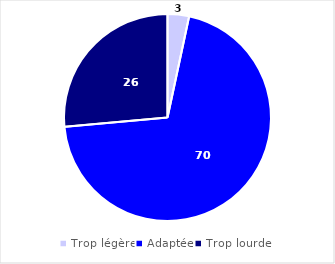
| Category | Series 0 |
|---|---|
| Trop légère | 3.357 |
| Adaptée | 70.212 |
| Trop lourde | 26.431 |